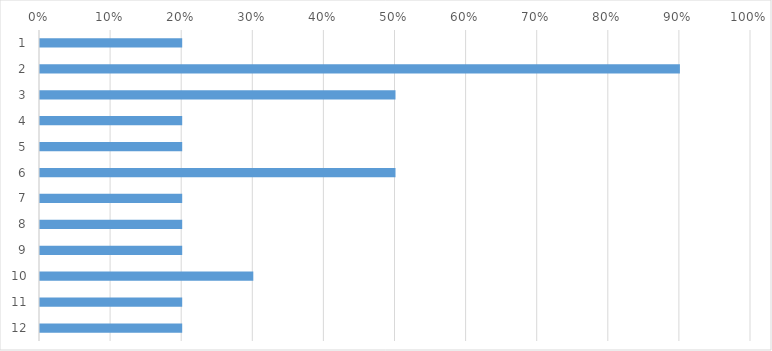
| Category | Series 0 |
|---|---|
| 0 | 0.2 |
| 1 | 0.9 |
| 2 | 0.5 |
| 3 | 0.2 |
| 4 | 0.2 |
| 5 | 0.5 |
| 6 | 0.2 |
| 7 | 0.2 |
| 8 | 0.2 |
| 9 | 0.3 |
| 10 | 0.2 |
| 11 | 0.2 |